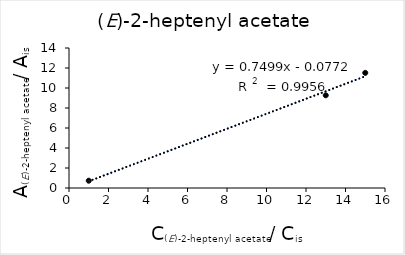
| Category | Series 0 |
|---|---|
| 1.0 | 0.73 |
| 13.0 | 9.27 |
| 15.0 | 11.515 |